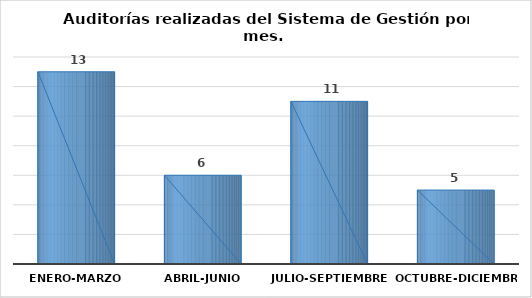
| Category | Series 0 |
|---|---|
| Enero-Marzo | 13 |
| Abril-Junio | 6 |
| Julio-Septiembre | 11 |
| Octubre-Diciembre | 5 |